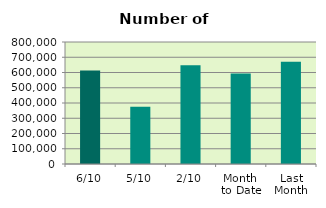
| Category | Series 0 |
|---|---|
| 6/10 | 613284 |
| 5/10 | 375412 |
| 2/10 | 646850 |
| Month 
to Date | 592922.5 |
| Last
Month | 670189.636 |